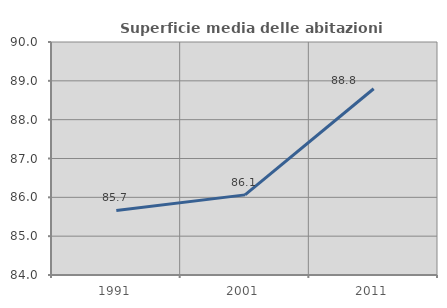
| Category | Superficie media delle abitazioni occupate |
|---|---|
| 1991.0 | 85.664 |
| 2001.0 | 86.063 |
| 2011.0 | 88.797 |